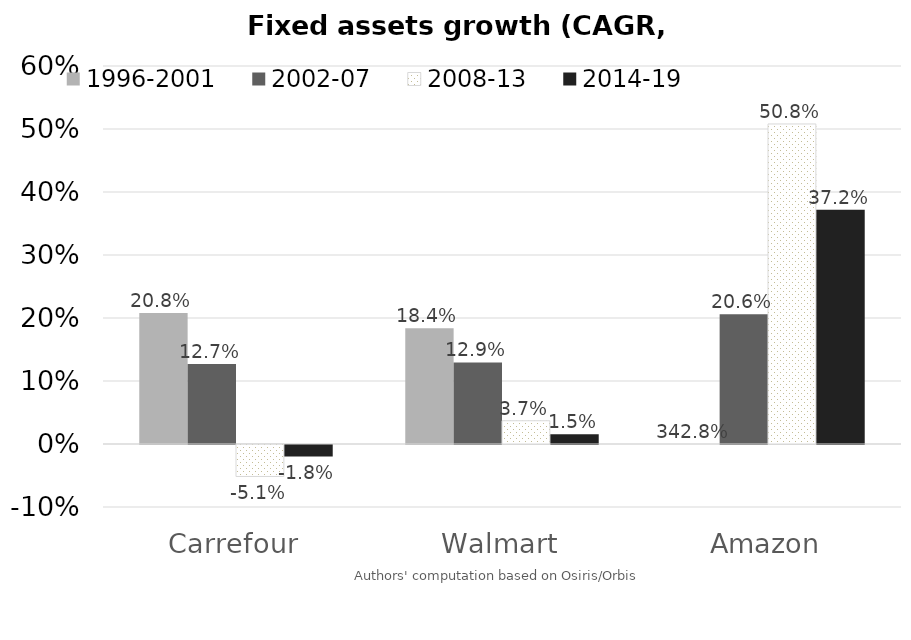
| Category | 1996-2001 | 2002-07 | 2008-13 | 2014-19 |
|---|---|---|---|---|
| Carrefour | 0.208 | 0.127 | -0.051 | -0.018 |
| Walmart | 0.184 | 0.129 | 0.037 | 0.015 |
| Amazon | 3.428 | 0.206 | 0.508 | 0.372 |